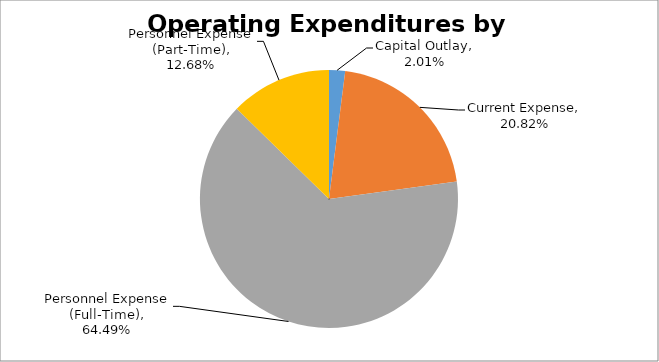
| Category | Series 0 |
|---|---|
| Capital Outlay | 0.02 |
| Current Expense | 0.208 |
| Personnel Expense (Full-Time) | 0.645 |
| Personnel Expense (Part-Time) | 0.127 |